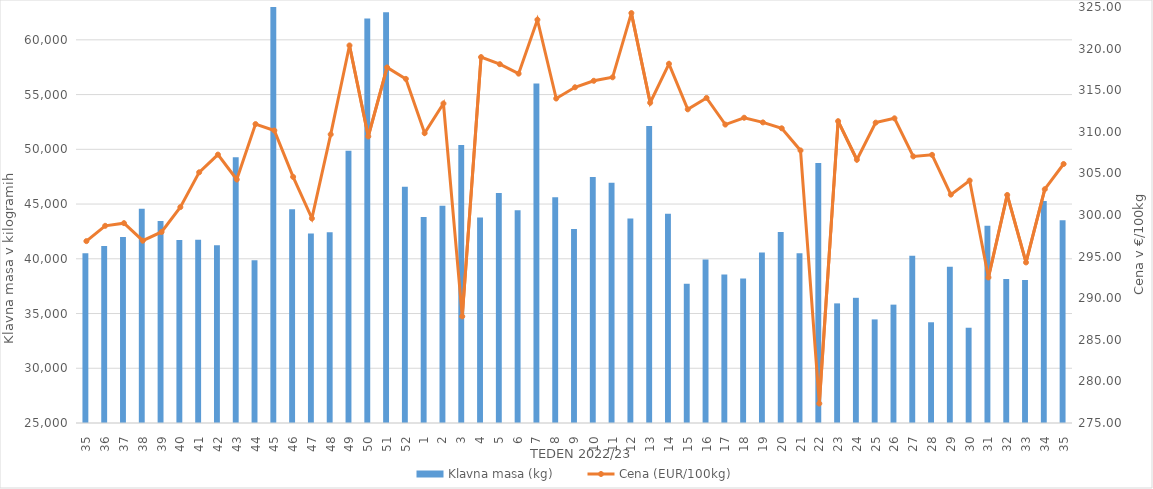
| Category | Klavna masa (kg) |
|---|---|
| 35.0 | 40507 |
| 36.0 | 41176 |
| 37.0 | 41983 |
| 38.0 | 44572 |
| 39.0 | 43447 |
| 40.0 | 41711 |
| 41.0 | 41736 |
| 42.0 | 41239 |
| 43.0 | 49284 |
| 44.0 | 39877 |
| 45.0 | 63668 |
| 46.0 | 44528 |
| 47.0 | 42319 |
| 48.0 | 42416 |
| 49.0 | 49873 |
| 50.0 | 61942 |
| 51.0 | 62514 |
| 52.0 | 46589 |
| 1.0 | 43807 |
| 2.0 | 44834 |
| 3.0 | 50386 |
| 4.0 | 43773 |
| 5.0 | 46011 |
| 6.0 | 44439 |
| 7.0 | 56001 |
| 8.0 | 45613 |
| 9.0 | 42730 |
| 10.0 | 47471 |
| 11.0 | 46952 |
| 12.0 | 43683 |
| 13.0 | 52135 |
| 14.0 | 44103 |
| 15.0 | 37719 |
| 16.0 | 39943 |
| 17.0 | 38574 |
| 18.0 | 38200 |
| 19.0 | 40581 |
| 20.0 | 42443 |
| 21.0 | 40517 |
| 22.0 | 48742 |
| 23.0 | 35927 |
| 24.0 | 36436 |
| 25.0 | 34463 |
| 26.0 | 35812 |
| 27.0 | 40280 |
| 28.0 | 34201 |
| 29.0 | 39279 |
| 30.0 | 33702 |
| 31.0 | 43020 |
| 32.0 | 38146 |
| 33.0 | 38070 |
| 34.0 | 45290 |
| 35.0 | 43513 |